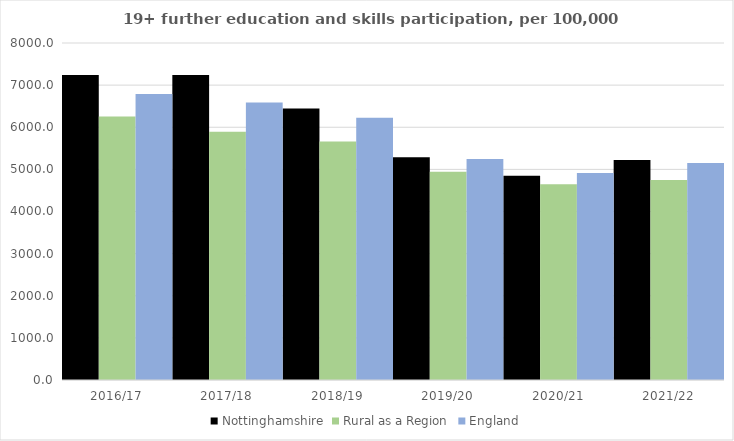
| Category | Nottinghamshire | Rural as a Region | England |
|---|---|---|---|
| 2016/17 | 7238.071 | 6253.401 | 6788 |
| 2017/18 | 7240.768 | 5892.029 | 6588 |
| 2018/19 | 6447.542 | 5661.873 | 6227 |
| 2019/20 | 5286.739 | 4943.801 | 5244 |
| 2020/21 | 4849.572 | 4646.727 | 4913 |
| 2021/22 | 5224.889 | 4747.049 | 5151 |